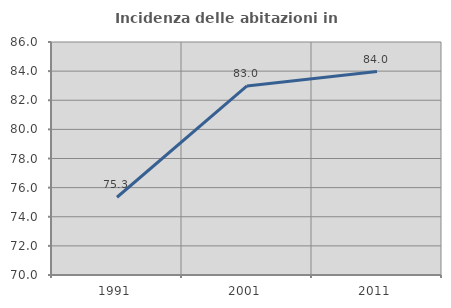
| Category | Incidenza delle abitazioni in proprietà  |
|---|---|
| 1991.0 | 75.34 |
| 2001.0 | 82.985 |
| 2011.0 | 83.967 |